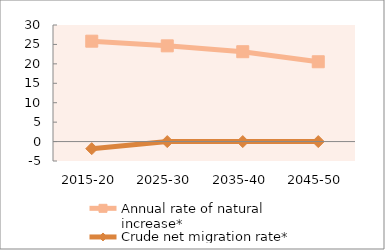
| Category | Annual rate of natural increase* | Crude net migration rate* |
|---|---|---|
| 2015-20 | 25.836 | -1.826 |
| 2025-30 | 24.636 | 0 |
| 2035-40 | 23.125 | 0 |
| 2045-50 | 20.541 | 0 |